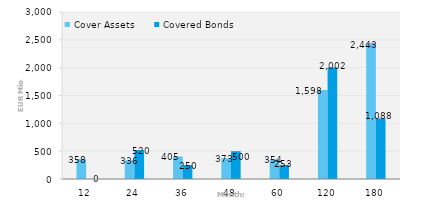
| Category | Cover Assets | Covered Bonds |
|---|---|---|
| 12.0 | 358 | 0 |
| 24.0 | 336 | 520 |
| 36.0 | 405 | 250 |
| 48.0 | 373 | 500 |
| 60.0 | 354 | 253 |
| 120.0 | 1598 | 2002 |
| 180.0 | 2443 | 1088 |